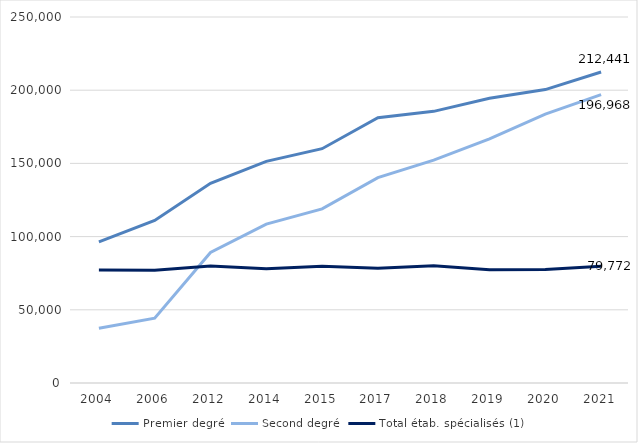
| Category | Premier degré | Second degré | Total étab. spécialisés (1) |
|---|---|---|---|
| 2004.0 | 96396 | 37442 | 77141 |
| 2006.0 | 111083 | 44278 | 76951 |
| 2012.0 | 136421 | 89142 | 79873 |
| 2014.0 | 151412 | 108529 | 77962 |
| 2015.0 | 160043 | 118935 | 79714 |
| 2017.0 | 181158 | 140318 | 78358 |
| 2018.0 | 185563 | 152232 | 80051 |
| 2019.0 | 194494 | 166680 | 77338 |
| 2020.0 | 200421 | 183619 | 77503 |
| 2021.0 | 212441 | 196968 | 79772 |